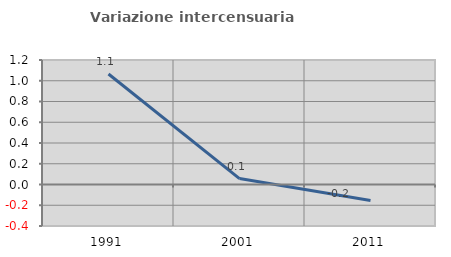
| Category | Variazione intercensuaria annua |
|---|---|
| 1991.0 | 1.065 |
| 2001.0 | 0.057 |
| 2011.0 | -0.155 |